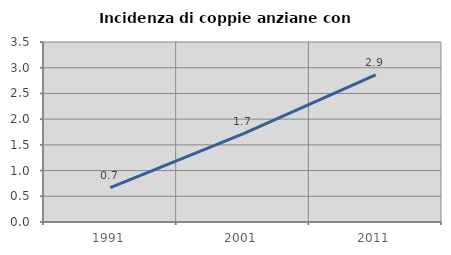
| Category | Incidenza di coppie anziane con figli |
|---|---|
| 1991.0 | 0.67 |
| 2001.0 | 1.714 |
| 2011.0 | 2.859 |